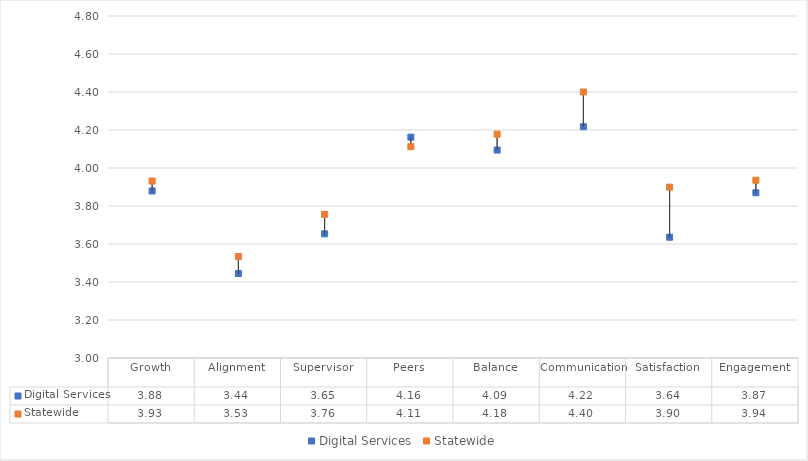
| Category | Digital Services | Statewide |
|---|---|---|
| Growth | 3.879 | 3.931 |
| Alignment | 3.445 | 3.534 |
| Supervisor | 3.654 | 3.756 |
| Peers | 4.162 | 4.112 |
| Balance | 4.094 | 4.178 |
| Communication | 4.217 | 4.4 |
| Satisfaction | 3.636 | 3.899 |
| Engagement | 3.87 | 3.936 |